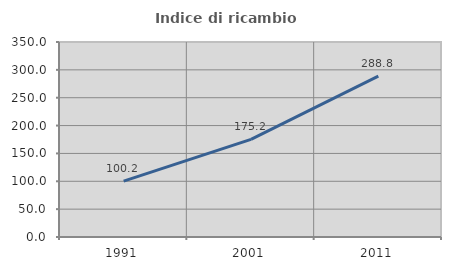
| Category | Indice di ricambio occupazionale  |
|---|---|
| 1991.0 | 100.208 |
| 2001.0 | 175.187 |
| 2011.0 | 288.752 |